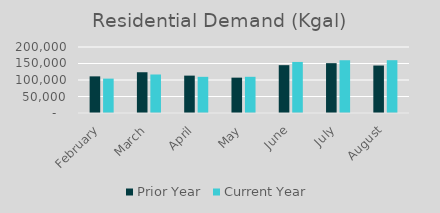
| Category | Prior Year | Current Year |
|---|---|---|
| February | 111009.962 | 104204.224 |
| March | 123525.131 | 116687.491 |
| April | 113258.787 | 109598.965 |
| May | 107128.051 | 109656.015 |
| June | 144930.453 | 154696.236 |
| July | 151028.014 | 159889.353 |
| August | 143816.337 | 160013.985 |